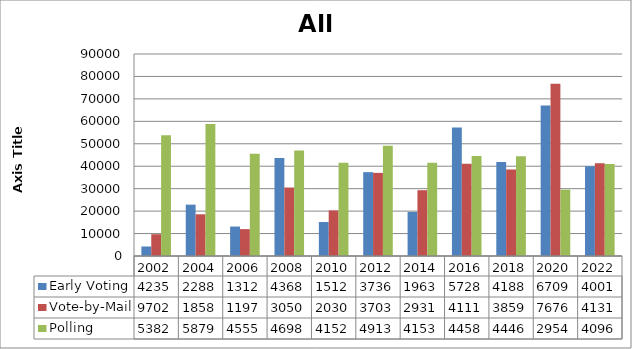
| Category | Early Voting | Vote-by-Mail | Polling |
|---|---|---|---|
| 2002.0 | 4235 | 9702 | 53828 |
| 2004.0 | 22882 | 18580 | 58791 |
| 2006.0 | 13122 | 11979 | 45553 |
| 2008.0 | 43686 | 30508 | 46987 |
| 2010.0 | 15129 | 20307 | 41522 |
| 2012.0 | 37360 | 37038 | 49137 |
| 2014.0 | 19632 | 29315 | 41534 |
| 2016.0 | 57289 | 41119 | 44587 |
| 2018.0 | 41882 | 38590 | 44466 |
| 2020.0 | 67098 | 76761 | 29548 |
| 2022.0 | 40015 | 41314 | 40969 |